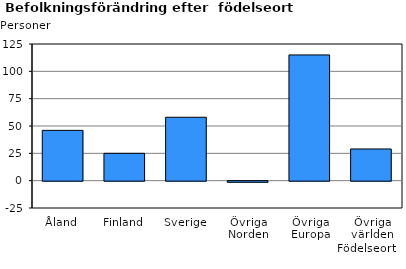
| Category | Series 0 |
|---|---|
| Åland | 46 |
| Finland | 25 |
| Sverige | 58 |
| Övriga Norden | -1 |
| Övriga Europa | 115 |
| Övriga världen | 29 |